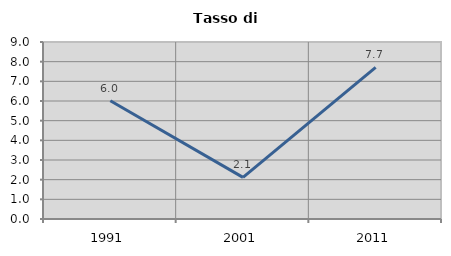
| Category | Tasso di disoccupazione   |
|---|---|
| 1991.0 | 6.013 |
| 2001.0 | 2.115 |
| 2011.0 | 7.706 |